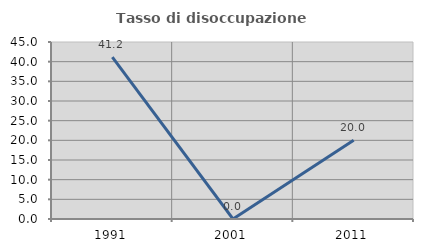
| Category | Tasso di disoccupazione giovanile  |
|---|---|
| 1991.0 | 41.176 |
| 2001.0 | 0 |
| 2011.0 | 20 |